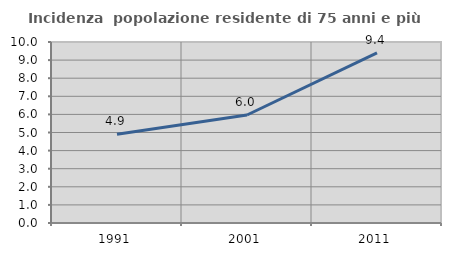
| Category | Incidenza  popolazione residente di 75 anni e più |
|---|---|
| 1991.0 | 4.907 |
| 2001.0 | 5.968 |
| 2011.0 | 9.398 |